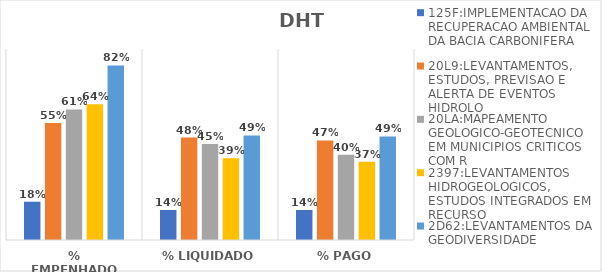
| Category | 125F:IMPLEMENTACAO DA RECUPERACAO AMBIENTAL DA BACIA CARBONIFERA | 20L9:LEVANTAMENTOS, ESTUDOS, PREVISAO E ALERTA DE EVENTOS HIDROLO | 20LA:MAPEAMENTO GEOLOGICO-GEOTECNICO EM MUNICIPIOS CRITICOS COM R | 2397:LEVANTAMENTOS HIDROGEOLOGICOS, ESTUDOS INTEGRADOS EM RECURSO | 2D62:LEVANTAMENTOS DA GEODIVERSIDADE |
|---|---|---|---|---|---|
| % EMPENHADO | 0.18 | 0.552 | 0.615 | 0.639 | 0.823 |
| % LIQUIDADO | 0.142 | 0.483 | 0.452 | 0.385 | 0.493 |
| % PAGO | 0.141 | 0.469 | 0.402 | 0.368 | 0.488 |